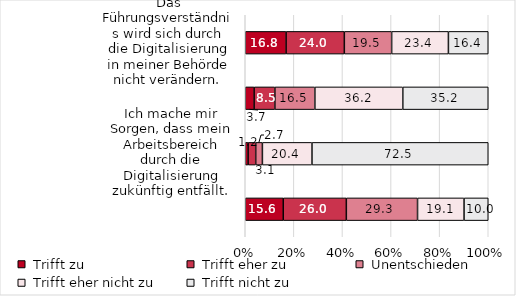
| Category | Series 0 | Series 1 | Series 2 | Series 3 | Series 4 |
|---|---|---|---|---|---|
| Das Führungsverständnis wird sich durch die Digitalisierung in meiner Behörde nicht verändern. | 16.803 | 23.975 | 19.467 | 23.361 | 16.393 |
| Ich werde durch die Digitalisierung an Gestaltungsfreiheiten und Entscheidungskompetenzen verlieren. | 3.659 | 8.537 | 16.463 | 36.179 | 35.163 |
| Ich mache mir Sorgen, dass mein Arbeitsbereich durch die Digitalisierung zukünftig entfällt. | 1.176 | 3.137 | 2.745 | 20.392 | 72.549 |
| Die Arbeitsbelastung wird durch die Digitalisierung zunehmen. | 15.625 | 25.977 | 29.297 | 19.141 | 9.961 |